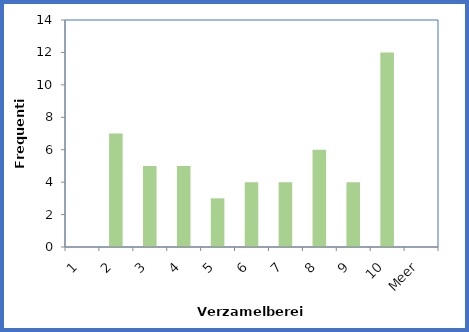
| Category | Frequentie |
|---|---|
| 1 | 0 |
| 2 | 7 |
| 3 | 5 |
| 4 | 5 |
| 5 | 3 |
| 6 | 4 |
| 7 | 4 |
| 8 | 6 |
| 9 | 4 |
| 10 | 12 |
| Meer | 0 |